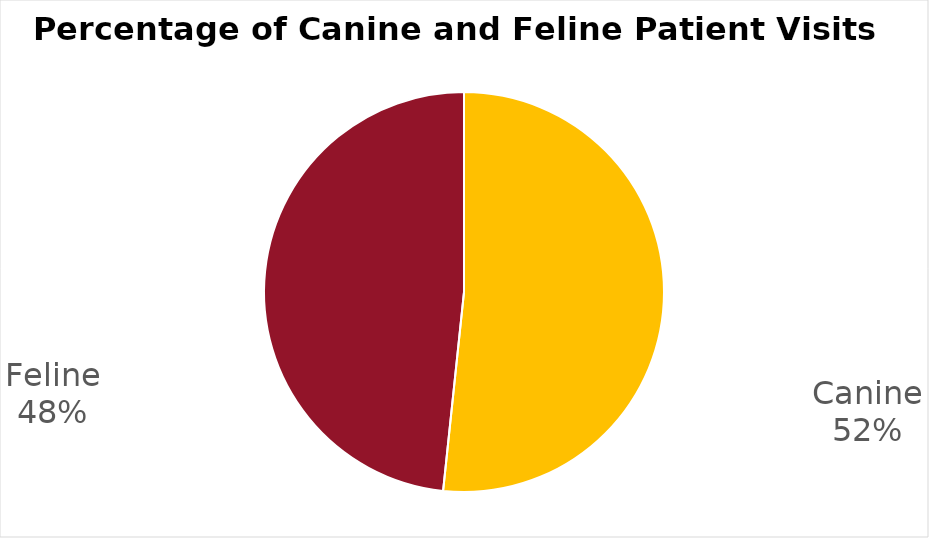
| Category | Series 0 |
|---|---|
| Canine | 62 |
| Feline | 58 |